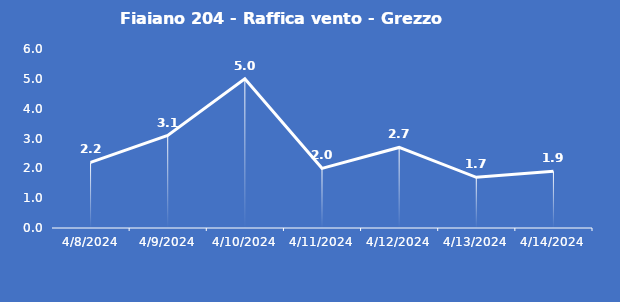
| Category | Fiaiano 204 - Raffica vento - Grezzo (m/s) |
|---|---|
| 4/8/24 | 2.2 |
| 4/9/24 | 3.1 |
| 4/10/24 | 5 |
| 4/11/24 | 2 |
| 4/12/24 | 2.7 |
| 4/13/24 | 1.7 |
| 4/14/24 | 1.9 |